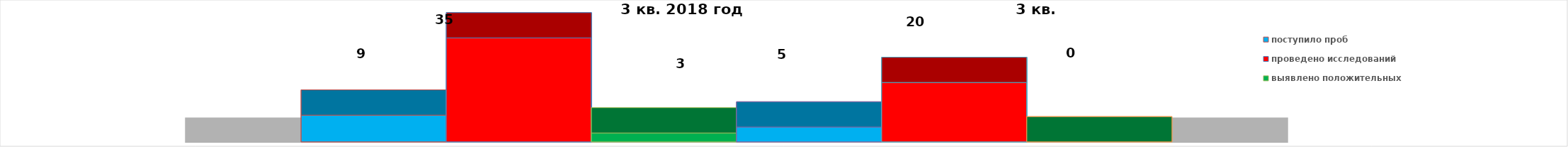
| Category | поступило проб | проведено исследований | выявлено положительных | 3 квартал 2019 год | 2016 год |
|---|---|---|---|---|---|
| 0 | 9 | 35 | 3 | 0 | 20 |